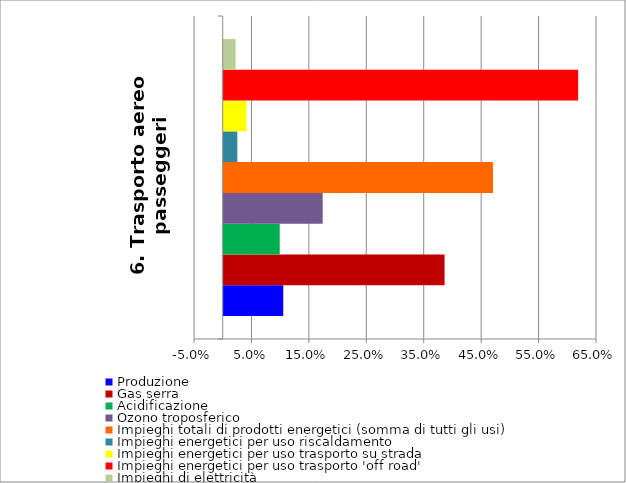
| Category | Produzione | Gas serra | Acidificazione | Ozono troposferico | Impieghi totali di prodotti energetici (somma di tutti gli usi) | Impieghi energetici per uso riscaldamento | Impieghi energetici per uso trasporto su strada | Impieghi energetici per uso trasporto 'off road' | Impieghi di elettricità |
|---|---|---|---|---|---|---|---|---|---|
| 6. Trasporto aereo passeggeri | 0.104 | 0.385 | 0.098 | 0.172 | 0.469 | 0.024 | 0.04 | 0.617 | 0.021 |